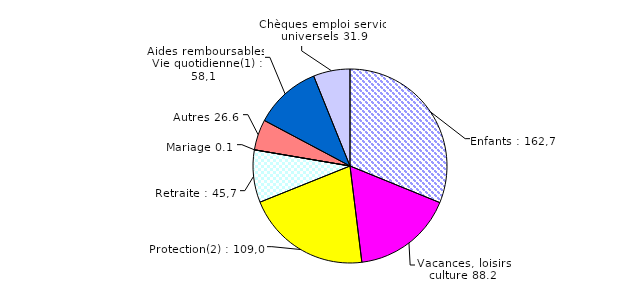
| Category | Series 0 |
|---|---|
| Enfants | 162.706 |
| Vacances, loisirs, culture | 88.176 |
| Protection(2) | 108.993 |
| Retraite  | 45.662 |
| Mariage | 0.073 |
| Autres | 26.605 |
| Aides remboursables  Vie quotidienne(1) | 58.066 |
| Chèques emploi service universels | 31.882 |